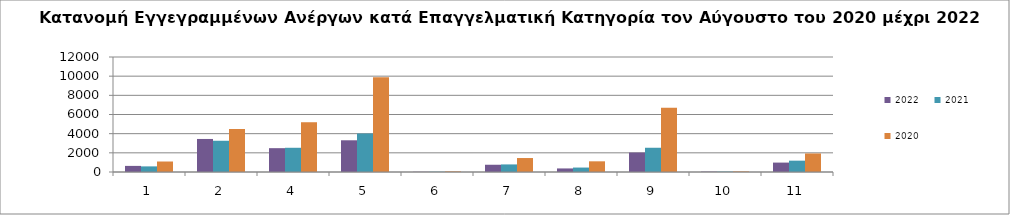
| Category | 2022 | 2021 | 2020 |
|---|---|---|---|
| 1.0 | 637 | 586 | 1095 |
| 2.0 | 3447 | 3260 | 4486 |
| 4.0 | 2487 | 2528 | 5193 |
| 5.0 | 3310 | 4016 | 9889 |
| 6.0 | 22 | 28 | 63 |
| 7.0 | 757 | 791 | 1458 |
| 8.0 | 372 | 464 | 1115 |
| 9.0 | 2031 | 2530 | 6701 |
| 10.0 | 40 | 40 | 60 |
| 11.0 | 982 | 1183 | 1935 |